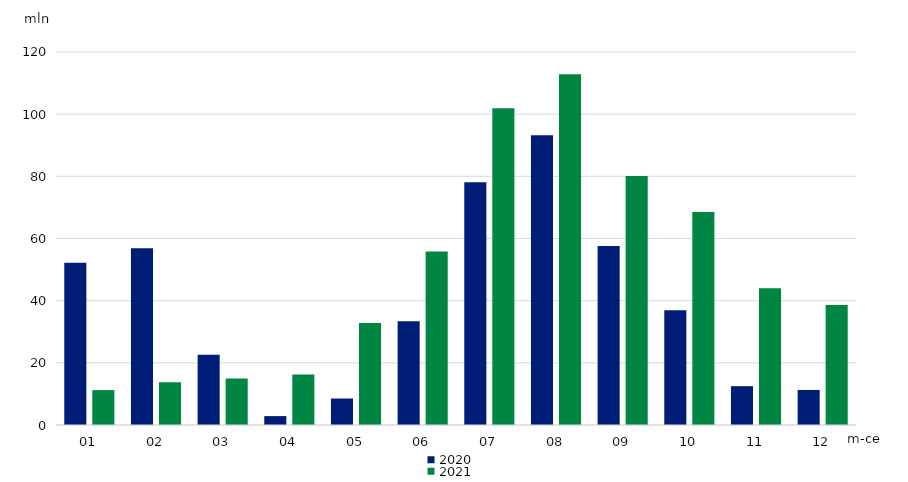
| Category | 2020 | 2021 |
|---|---|---|
| 01 | 52.23 | 11.216 |
| 02 | 56.857 | 13.749 |
| 03 | 22.623 | 14.955 |
| 04 | 2.865 | 16.212 |
| 05 | 8.526 | 32.777 |
| 06 | 33.403 | 55.849 |
| 07 | 78.112 | 101.941 |
| 08 | 93.21 | 112.851 |
| 09 | 57.616 | 80.134 |
| 10 | 36.923 | 68.554 |
| 11 | 12.496 | 44.032 |
| 12 | 11.275 | 38.62 |